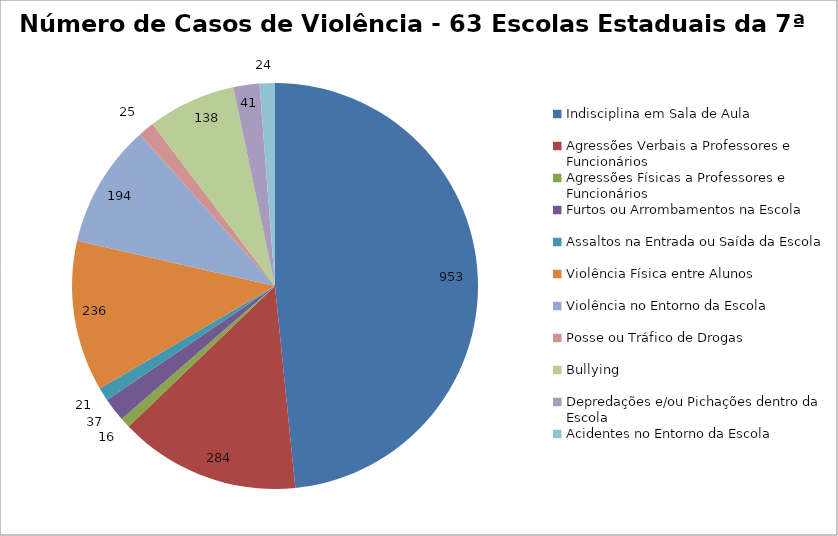
| Category | Número de Casos |
|---|---|
| Indisciplina em Sala de Aula | 953 |
| Agressões Verbais a Professores e Funcionários | 284 |
| Agressões Físicas a Professores e Funcionários | 16 |
| Furtos ou Arrombamentos na Escola | 37 |
| Assaltos na Entrada ou Saída da Escola | 21 |
| Violência Física entre Alunos | 236 |
| Violência no Entorno da Escola | 194 |
| Posse ou Tráfico de Drogas | 25 |
| Bullying | 138 |
| Depredações e/ou Pichações dentro da Escola | 41 |
| Acidentes no Entorno da Escola | 24 |